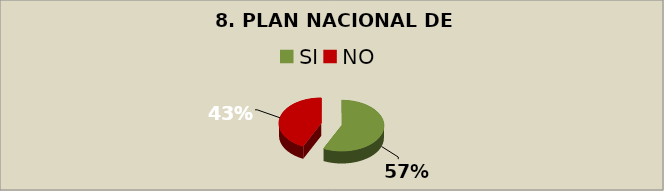
| Category | Series 0 |
|---|---|
| SI | 0.57 |
| NO | 0.43 |